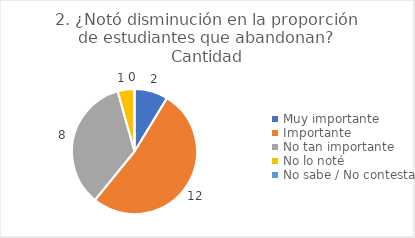
| Category | 2. ¿Notó disminución en la proporción de estudiantes que abandonan? |
|---|---|
| Muy importante  | 0.087 |
| Importante  | 0.522 |
| No tan importante  | 0.348 |
| No lo noté  | 0.043 |
| No sabe / No contesta | 0 |